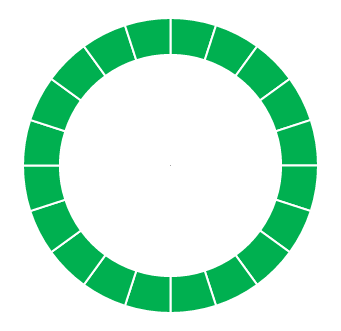
| Category | Series 1 |
|---|---|
| 0 | 0.95 |
| 1 | 0.05 |